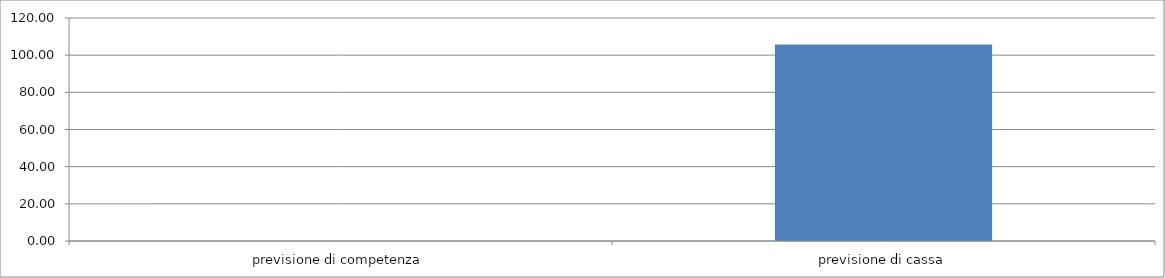
| Category | Series 0 |
|---|---|
| previsione di competenza | 0 |
| previsione di cassa | 105.73 |